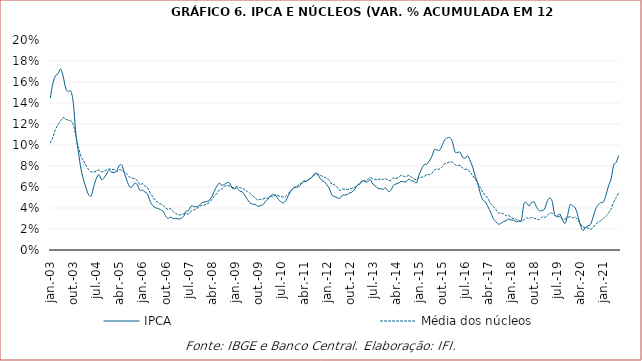
| Category | IPCA | Média dos núcleos |
|---|---|---|
| 2003-01-01 | 0.145 | 0.102 |
| 2003-02-01 | 0.158 | 0.107 |
| 2003-03-01 | 0.166 | 0.115 |
| 2003-04-01 | 0.168 | 0.119 |
| 2003-05-01 | 0.172 | 0.123 |
| 2003-06-01 | 0.166 | 0.126 |
| 2003-07-01 | 0.154 | 0.125 |
| 2003-08-01 | 0.151 | 0.123 |
| 2003-09-01 | 0.151 | 0.123 |
| 2003-10-01 | 0.14 | 0.119 |
| 2003-11-01 | 0.11 | 0.108 |
| 2003-12-01 | 0.093 | 0.098 |
| 2004-01-01 | 0.077 | 0.089 |
| 2004-02-01 | 0.067 | 0.085 |
| 2004-03-01 | 0.059 | 0.08 |
| 2004-04-01 | 0.053 | 0.077 |
| 2004-05-01 | 0.052 | 0.074 |
| 2004-06-01 | 0.061 | 0.074 |
| 2004-07-01 | 0.068 | 0.075 |
| 2004-08-01 | 0.072 | 0.076 |
| 2004-09-01 | 0.067 | 0.074 |
| 2004-10-01 | 0.069 | 0.075 |
| 2004-11-01 | 0.072 | 0.076 |
| 2004-12-01 | 0.076 | 0.077 |
| 2005-01-01 | 0.074 | 0.076 |
| 2005-02-01 | 0.074 | 0.077 |
| 2005-03-01 | 0.075 | 0.075 |
| 2005-04-01 | 0.081 | 0.076 |
| 2005-05-01 | 0.081 | 0.076 |
| 2005-06-01 | 0.073 | 0.074 |
| 2005-07-01 | 0.066 | 0.072 |
| 2005-08-01 | 0.06 | 0.069 |
| 2005-09-01 | 0.06 | 0.068 |
| 2005-10-01 | 0.064 | 0.068 |
| 2005-11-01 | 0.062 | 0.066 |
| 2005-12-01 | 0.057 | 0.062 |
| 2006-01-01 | 0.057 | 0.063 |
| 2006-02-01 | 0.055 | 0.061 |
| 2006-03-01 | 0.053 | 0.059 |
| 2006-04-01 | 0.046 | 0.055 |
| 2006-05-01 | 0.042 | 0.051 |
| 2006-06-01 | 0.04 | 0.047 |
| 2006-07-01 | 0.04 | 0.045 |
| 2006-08-01 | 0.038 | 0.044 |
| 2006-09-01 | 0.037 | 0.043 |
| 2006-10-01 | 0.033 | 0.04 |
| 2006-11-01 | 0.03 | 0.039 |
| 2006-12-01 | 0.031 | 0.039 |
| 2007-01-01 | 0.03 | 0.036 |
| 2007-02-01 | 0.03 | 0.035 |
| 2007-03-01 | 0.03 | 0.033 |
| 2007-04-01 | 0.03 | 0.034 |
| 2007-05-01 | 0.032 | 0.035 |
| 2007-06-01 | 0.037 | 0.035 |
| 2007-07-01 | 0.037 | 0.034 |
| 2007-08-01 | 0.042 | 0.037 |
| 2007-09-01 | 0.041 | 0.038 |
| 2007-10-01 | 0.041 | 0.039 |
| 2007-11-01 | 0.042 | 0.041 |
| 2007-12-01 | 0.045 | 0.042 |
| 2008-01-01 | 0.046 | 0.043 |
| 2008-02-01 | 0.046 | 0.044 |
| 2008-03-01 | 0.047 | 0.045 |
| 2008-04-01 | 0.05 | 0.048 |
| 2008-05-01 | 0.056 | 0.051 |
| 2008-06-01 | 0.061 | 0.054 |
| 2008-07-01 | 0.064 | 0.057 |
| 2008-08-01 | 0.062 | 0.058 |
| 2008-09-01 | 0.063 | 0.061 |
| 2008-10-01 | 0.064 | 0.061 |
| 2008-11-01 | 0.064 | 0.061 |
| 2008-12-01 | 0.059 | 0.06 |
| 2009-01-01 | 0.058 | 0.059 |
| 2009-02-01 | 0.059 | 0.061 |
| 2009-03-01 | 0.056 | 0.059 |
| 2009-04-01 | 0.055 | 0.059 |
| 2009-05-01 | 0.052 | 0.057 |
| 2009-06-01 | 0.048 | 0.056 |
| 2009-07-01 | 0.045 | 0.054 |
| 2009-08-01 | 0.044 | 0.052 |
| 2009-09-01 | 0.043 | 0.05 |
| 2009-10-01 | 0.042 | 0.048 |
| 2009-11-01 | 0.042 | 0.048 |
| 2009-12-01 | 0.043 | 0.048 |
| 2010-01-01 | 0.046 | 0.05 |
| 2010-02-01 | 0.048 | 0.049 |
| 2010-03-01 | 0.052 | 0.051 |
| 2010-04-01 | 0.053 | 0.051 |
| 2010-05-01 | 0.052 | 0.052 |
| 2010-06-01 | 0.048 | 0.052 |
| 2010-07-01 | 0.046 | 0.051 |
| 2010-08-01 | 0.045 | 0.051 |
| 2010-09-01 | 0.047 | 0.051 |
| 2010-10-01 | 0.052 | 0.054 |
| 2010-11-01 | 0.056 | 0.056 |
| 2010-12-01 | 0.059 | 0.059 |
| 2011-01-01 | 0.06 | 0.06 |
| 2011-02-01 | 0.06 | 0.062 |
| 2011-03-01 | 0.063 | 0.064 |
| 2011-04-01 | 0.065 | 0.066 |
| 2011-05-01 | 0.066 | 0.065 |
| 2011-06-01 | 0.067 | 0.067 |
| 2011-07-01 | 0.069 | 0.069 |
| 2011-08-01 | 0.072 | 0.071 |
| 2011-09-01 | 0.073 | 0.073 |
| 2011-10-01 | 0.07 | 0.072 |
| 2011-11-01 | 0.066 | 0.071 |
| 2011-12-01 | 0.065 | 0.069 |
| 2012-01-01 | 0.062 | 0.068 |
| 2012-02-01 | 0.058 | 0.066 |
| 2012-03-01 | 0.052 | 0.063 |
| 2012-04-01 | 0.051 | 0.062 |
| 2012-05-01 | 0.05 | 0.06 |
| 2012-06-01 | 0.049 | 0.057 |
| 2012-07-01 | 0.052 | 0.058 |
| 2012-08-01 | 0.052 | 0.058 |
| 2012-09-01 | 0.053 | 0.058 |
| 2012-10-01 | 0.055 | 0.058 |
| 2012-11-01 | 0.055 | 0.059 |
| 2012-12-01 | 0.058 | 0.06 |
| 2013-01-01 | 0.062 | 0.062 |
| 2013-02-01 | 0.063 | 0.064 |
| 2013-03-01 | 0.066 | 0.066 |
| 2013-04-01 | 0.065 | 0.066 |
| 2013-05-01 | 0.065 | 0.067 |
| 2013-06-01 | 0.067 | 0.069 |
| 2013-07-01 | 0.063 | 0.068 |
| 2013-08-01 | 0.061 | 0.067 |
| 2013-09-01 | 0.059 | 0.067 |
| 2013-10-01 | 0.058 | 0.068 |
| 2013-11-01 | 0.058 | 0.067 |
| 2013-12-01 | 0.059 | 0.068 |
| 2014-01-01 | 0.056 | 0.066 |
| 2014-02-01 | 0.057 | 0.066 |
| 2014-03-01 | 0.062 | 0.069 |
| 2014-04-01 | 0.063 | 0.068 |
| 2014-05-01 | 0.064 | 0.069 |
| 2014-06-01 | 0.065 | 0.071 |
| 2014-07-01 | 0.065 | 0.07 |
| 2014-08-01 | 0.065 | 0.07 |
| 2014-09-01 | 0.067 | 0.071 |
| 2014-10-01 | 0.066 | 0.07 |
| 2014-11-01 | 0.066 | 0.068 |
| 2014-12-01 | 0.064 | 0.067 |
| 2015-01-01 | 0.071 | 0.069 |
| 2015-02-01 | 0.077 | 0.069 |
| 2015-03-01 | 0.081 | 0.07 |
| 2015-04-01 | 0.082 | 0.072 |
| 2015-05-01 | 0.085 | 0.072 |
| 2015-06-01 | 0.089 | 0.073 |
| 2015-07-01 | 0.096 | 0.076 |
| 2015-08-01 | 0.095 | 0.077 |
| 2015-09-01 | 0.095 | 0.077 |
| 2015-10-01 | 0.099 | 0.079 |
| 2015-11-01 | 0.105 | 0.082 |
| 2015-12-01 | 0.107 | 0.083 |
| 2016-01-01 | 0.107 | 0.084 |
| 2016-02-01 | 0.104 | 0.084 |
| 2016-03-01 | 0.094 | 0.081 |
| 2016-04-01 | 0.093 | 0.08 |
| 2016-05-01 | 0.093 | 0.081 |
| 2016-06-01 | 0.088 | 0.078 |
| 2016-07-01 | 0.087 | 0.077 |
| 2016-08-01 | 0.09 | 0.077 |
| 2016-09-01 | 0.085 | 0.074 |
| 2016-10-01 | 0.079 | 0.071 |
| 2016-11-01 | 0.07 | 0.067 |
| 2016-12-01 | 0.063 | 0.064 |
| 2017-01-01 | 0.054 | 0.059 |
| 2017-02-01 | 0.048 | 0.055 |
| 2017-03-01 | 0.046 | 0.052 |
| 2017-04-01 | 0.041 | 0.049 |
| 2017-05-01 | 0.036 | 0.044 |
| 2017-06-01 | 0.03 | 0.042 |
| 2017-07-01 | 0.027 | 0.038 |
| 2017-08-01 | 0.025 | 0.035 |
| 2017-09-01 | 0.025 | 0.035 |
| 2017-10-01 | 0.027 | 0.034 |
| 2017-11-01 | 0.028 | 0.033 |
| 2017-12-01 | 0.029 | 0.033 |
| 2018-01-01 | 0.029 | 0.031 |
| 2018-02-01 | 0.028 | 0.03 |
| 2018-03-01 | 0.027 | 0.029 |
| 2018-04-01 | 0.028 | 0.028 |
| 2018-05-01 | 0.029 | 0.027 |
| 2018-06-01 | 0.044 | 0.029 |
| 2018-07-01 | 0.045 | 0.03 |
| 2018-08-01 | 0.042 | 0.03 |
| 2018-09-01 | 0.045 | 0.031 |
| 2018-10-01 | 0.046 | 0.03 |
| 2018-11-01 | 0.04 | 0.03 |
| 2018-12-01 | 0.037 | 0.029 |
| 2019-01-01 | 0.038 | 0.031 |
| 2019-02-01 | 0.039 | 0.031 |
| 2019-03-01 | 0.046 | 0.032 |
| 2019-04-01 | 0.049 | 0.035 |
| 2019-05-01 | 0.047 | 0.035 |
| 2019-06-01 | 0.034 | 0.033 |
| 2019-07-01 | 0.032 | 0.032 |
| 2019-08-01 | 0.034 | 0.032 |
| 2019-09-01 | 0.029 | 0.03 |
| 2019-10-01 | 0.025 | 0.03 |
| 2019-11-01 | 0.033 | 0.031 |
| 2019-12-01 | 0.043 | 0.032 |
| 2020-01-01 | 0.042 | 0.031 |
| 2020-02-01 | 0.04 | 0.031 |
| 2020-03-01 | 0.033 | 0.029 |
| 2020-04-01 | 0.024 | 0.025 |
| 2020-05-01 | 0.019 | 0.022 |
| 2020-06-01 | 0.021 | 0.021 |
| 2020-07-01 | 0.023 | 0.021 |
| 2020-08-01 | 0.024 | 0.02 |
| 2020-09-01 | 0.031 | 0.022 |
| 2020-10-01 | 0.039 | 0.024 |
| 2020-11-01 | 0.043 | 0.026 |
| 2020-12-01 | 0.045 | 0.028 |
| 2021-01-01 | 0.046 | 0.03 |
| 2021-02-01 | 0.052 | 0.032 |
| 2021-03-01 | 0.061 | 0.035 |
| 2021-04-01 | 0.068 | 0.039 |
| 2021-05-01 | 0.081 | 0.045 |
| 2021-06-01 | 0.083 | 0.05 |
| 2021-07-01 | 0.09 | 0.055 |